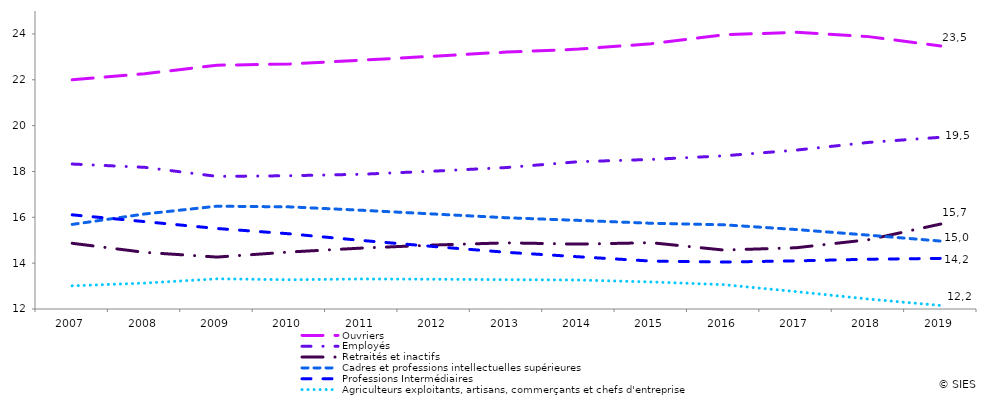
| Category | Ouvriers | Employés | Retraités et inactifs | Cadres et professions intellectuelles supérieures | Professions Intermédiaires | Agriculteurs exploitants, artisans, commerçants et chefs d'entreprise |
|---|---|---|---|---|---|---|
| 2007.0 | 22.001 | 18.324 | 14.867 | 15.69 | 16.108 | 13.011 |
| 2008.0 | 22.262 | 18.181 | 14.471 | 16.145 | 15.812 | 13.13 |
| 2009.0 | 22.635 | 17.786 | 14.265 | 16.485 | 15.512 | 13.317 |
| 2010.0 | 22.688 | 17.814 | 14.486 | 16.455 | 15.281 | 13.277 |
| 2011.0 | 22.856 | 17.878 | 14.658 | 16.307 | 14.99 | 13.31 |
| 2012.0 | 23.028 | 18.015 | 14.791 | 16.143 | 14.724 | 13.299 |
| 2013.0 | 23.209 | 18.171 | 14.886 | 15.981 | 14.473 | 13.28 |
| 2014.0 | 23.337 | 18.427 | 14.83 | 15.865 | 14.277 | 13.264 |
| 2015.0 | 23.573 | 18.525 | 14.892 | 15.74 | 14.09 | 13.18 |
| 2016.0 | 23.963 | 18.681 | 14.572 | 15.674 | 14.048 | 13.063 |
| 2017.0 | 24.074 | 18.931 | 14.671 | 15.467 | 14.099 | 12.758 |
| 2018.0 | 23.882 | 19.268 | 15.023 | 15.222 | 14.172 | 12.434 |
| 2019.0 | 23.476 | 19.491 | 15.707 | 14.962 | 14.209 | 12.154 |